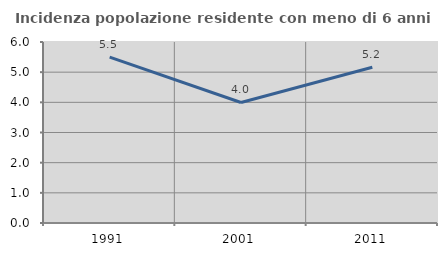
| Category | Incidenza popolazione residente con meno di 6 anni |
|---|---|
| 1991.0 | 5.5 |
| 2001.0 | 3.995 |
| 2011.0 | 5.165 |